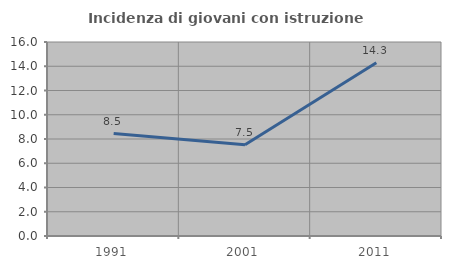
| Category | Incidenza di giovani con istruzione universitaria |
|---|---|
| 1991.0 | 8.451 |
| 2001.0 | 7.527 |
| 2011.0 | 14.286 |